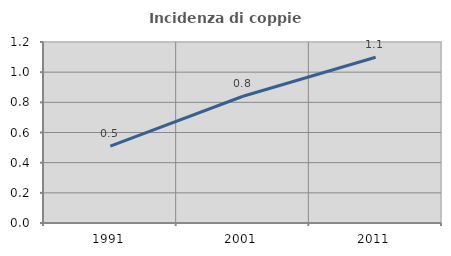
| Category | Incidenza di coppie miste |
|---|---|
| 1991.0 | 0.51 |
| 2001.0 | 0.84 |
| 2011.0 | 1.099 |